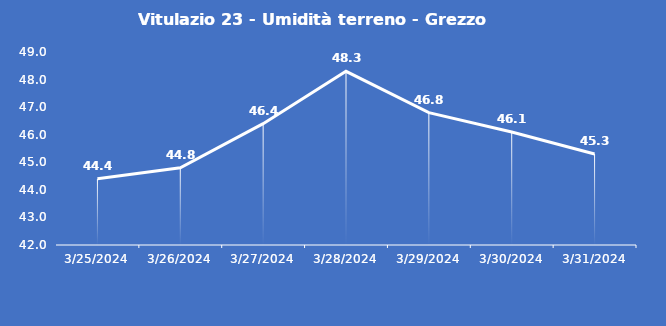
| Category | Vitulazio 23 - Umidità terreno - Grezzo (%VWC) |
|---|---|
| 3/25/24 | 44.4 |
| 3/26/24 | 44.8 |
| 3/27/24 | 46.4 |
| 3/28/24 | 48.3 |
| 3/29/24 | 46.8 |
| 3/30/24 | 46.1 |
| 3/31/24 | 45.3 |